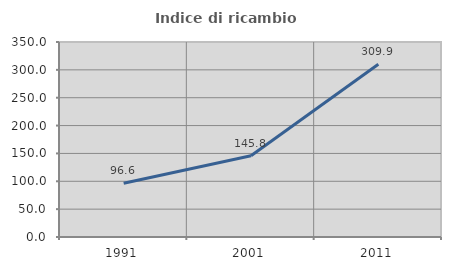
| Category | Indice di ricambio occupazionale  |
|---|---|
| 1991.0 | 96.552 |
| 2001.0 | 145.771 |
| 2011.0 | 309.924 |